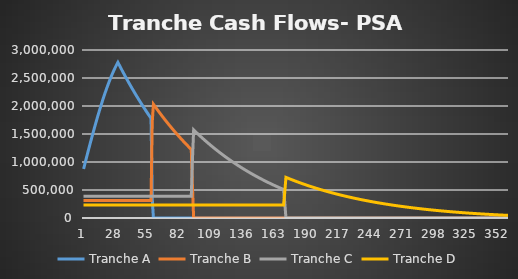
| Category | Tranche A | Tranche B | Tranche C | Tranche D |
|---|---|---|---|---|
| 0 | 876175.253 | 312500 | 390625 | 234375 |
| 1 | 959236.73 | 312500 | 390625 | 234375 |
| 2 | 1041774.351 | 312500 | 390625 | 234375 |
| 3 | 1123702.65 | 312500 | 390625 | 234375 |
| 4 | 1204936.25 | 312500 | 390625 | 234375 |
| 5 | 1285390.009 | 312500 | 390625 | 234375 |
| 6 | 1364979.159 | 312500 | 390625 | 234375 |
| 7 | 1443619.46 | 312500 | 390625 | 234375 |
| 8 | 1521227.336 | 312500 | 390625 | 234375 |
| 9 | 1597720.027 | 312500 | 390625 | 234375 |
| 10 | 1673015.732 | 312500 | 390625 | 234375 |
| 11 | 1747033.754 | 312500 | 390625 | 234375 |
| 12 | 1819694.643 | 312500 | 390625 | 234375 |
| 13 | 1890920.344 | 312500 | 390625 | 234375 |
| 14 | 1960634.332 | 312500 | 390625 | 234375 |
| 15 | 2028761.755 | 312500 | 390625 | 234375 |
| 16 | 2095229.571 | 312500 | 390625 | 234375 |
| 17 | 2159966.681 | 312500 | 390625 | 234375 |
| 18 | 2222904.062 | 312500 | 390625 | 234375 |
| 19 | 2283974.897 | 312500 | 390625 | 234375 |
| 20 | 2343114.696 | 312500 | 390625 | 234375 |
| 21 | 2400261.419 | 312500 | 390625 | 234375 |
| 22 | 2455355.593 | 312500 | 390625 | 234375 |
| 23 | 2508340.422 | 312500 | 390625 | 234375 |
| 24 | 2559161.899 | 312500 | 390625 | 234375 |
| 25 | 2607768.899 | 312500 | 390625 | 234375 |
| 26 | 2654113.284 | 312500 | 390625 | 234375 |
| 27 | 2698149.991 | 312500 | 390625 | 234375 |
| 28 | 2739837.115 | 312500 | 390625 | 234375 |
| 29 | 2779135.987 | 312500 | 390625 | 234375 |
| 30 | 2737980.107 | 312500 | 390625 | 234375 |
| 31 | 2697267.418 | 312500 | 390625 | 234375 |
| 32 | 2656993.197 | 312500 | 390625 | 234375 |
| 33 | 2617152.77 | 312500 | 390625 | 234375 |
| 34 | 2577741.51 | 312500 | 390625 | 234375 |
| 35 | 2538754.844 | 312500 | 390625 | 234375 |
| 36 | 2500188.243 | 312500 | 390625 | 234375 |
| 37 | 2462037.229 | 312500 | 390625 | 234375 |
| 38 | 2424297.371 | 312500 | 390625 | 234375 |
| 39 | 2386964.283 | 312500 | 390625 | 234375 |
| 40 | 2350033.629 | 312500 | 390625 | 234375 |
| 41 | 2313501.117 | 312500 | 390625 | 234375 |
| 42 | 2277362.501 | 312500 | 390625 | 234375 |
| 43 | 2241613.579 | 312500 | 390625 | 234375 |
| 44 | 2206250.196 | 312500 | 390625 | 234375 |
| 45 | 2171268.239 | 312500 | 390625 | 234375 |
| 46 | 2136663.64 | 312500 | 390625 | 234375 |
| 47 | 2102432.373 | 312500 | 390625 | 234375 |
| 48 | 2068570.456 | 312500 | 390625 | 234375 |
| 49 | 2035073.949 | 312500 | 390625 | 234375 |
| 50 | 2001938.953 | 312500 | 390625 | 234375 |
| 51 | 1969161.611 | 312500 | 390625 | 234375 |
| 52 | 1936738.107 | 312500 | 390625 | 234375 |
| 53 | 1904664.667 | 312500 | 390625 | 234375 |
| 54 | 1872937.554 | 312500 | 390625 | 234375 |
| 55 | 1841553.072 | 312500 | 390625 | 234375 |
| 56 | 1810507.567 | 312500 | 390625 | 234375 |
| 57 | 1779797.419 | 312500 | 390625 | 234375 |
| 58 | 355292.807 | 1706626.244 | 390625 | 234375 |
| 59 | 0 | 2031868.919 | 390625 | 234375 |
| 60 | 0 | 2002143.522 | 390625 | 234375 |
| 61 | 0 | 1972739.394 | 390625 | 234375 |
| 62 | 0 | 1943653.104 | 390625 | 234375 |
| 63 | 0 | 1914881.26 | 390625 | 234375 |
| 64 | 0 | 1886420.504 | 390625 | 234375 |
| 65 | 0 | 1858267.516 | 390625 | 234375 |
| 66 | 0 | 1830419.01 | 390625 | 234375 |
| 67 | 0 | 1802871.735 | 390625 | 234375 |
| 68 | 0 | 1775622.474 | 390625 | 234375 |
| 69 | 0 | 1748668.044 | 390625 | 234375 |
| 70 | 0 | 1722005.298 | 390625 | 234375 |
| 71 | 0 | 1695631.12 | 390625 | 234375 |
| 72 | 0 | 1669542.429 | 390625 | 234375 |
| 73 | 0 | 1643736.175 | 390625 | 234375 |
| 74 | 0 | 1618209.342 | 390625 | 234375 |
| 75 | 0 | 1592958.944 | 390625 | 234375 |
| 76 | 0 | 1567982.029 | 390625 | 234375 |
| 77 | 0 | 1543275.676 | 390625 | 234375 |
| 78 | 0 | 1518836.993 | 390625 | 234375 |
| 79 | 0 | 1494663.121 | 390625 | 234375 |
| 80 | 0 | 1470751.231 | 390625 | 234375 |
| 81 | 0 | 1447098.523 | 390625 | 234375 |
| 82 | 0 | 1423702.227 | 390625 | 234375 |
| 83 | 0 | 1400559.604 | 390625 | 234375 |
| 84 | 0 | 1377667.943 | 390625 | 234375 |
| 85 | 0 | 1355024.56 | 390625 | 234375 |
| 86 | 0 | 1332626.804 | 390625 | 234375 |
| 87 | 0 | 1310472.047 | 390625 | 234375 |
| 88 | 0 | 1288557.693 | 390625 | 234375 |
| 89 | 0 | 1266881.171 | 390625 | 234375 |
| 90 | 0 | 1245439.94 | 390625 | 234375 |
| 91 | 0 | 1224231.482 | 390625 | 234375 |
| 92 | 0 | 550651.351 | 1043226.959 | 234375 |
| 93 | 0 | 0 | 1573127.962 | 234375 |
| 94 | 0 | 0 | 1552603 | 234375 |
| 95 | 0 | 0 | 1532301.015 | 234375 |
| 96 | 0 | 0 | 1512219.622 | 234375 |
| 97 | 0 | 0 | 1492356.462 | 234375 |
| 98 | 0 | 0 | 1472709.2 | 234375 |
| 99 | 0 | 0 | 1453275.527 | 234375 |
| 100 | 0 | 0 | 1434053.158 | 234375 |
| 101 | 0 | 0 | 1415039.833 | 234375 |
| 102 | 0 | 0 | 1396233.315 | 234375 |
| 103 | 0 | 0 | 1377631.391 | 234375 |
| 104 | 0 | 0 | 1359231.873 | 234375 |
| 105 | 0 | 0 | 1341032.593 | 234375 |
| 106 | 0 | 0 | 1323031.41 | 234375 |
| 107 | 0 | 0 | 1305226.204 | 234375 |
| 108 | 0 | 0 | 1287614.876 | 234375 |
| 109 | 0 | 0 | 1270195.352 | 234375 |
| 110 | 0 | 0 | 1252965.578 | 234375 |
| 111 | 0 | 0 | 1235923.523 | 234375 |
| 112 | 0 | 0 | 1219067.177 | 234375 |
| 113 | 0 | 0 | 1202394.553 | 234375 |
| 114 | 0 | 0 | 1185903.682 | 234375 |
| 115 | 0 | 0 | 1169592.619 | 234375 |
| 116 | 0 | 0 | 1153459.438 | 234375 |
| 117 | 0 | 0 | 1137502.233 | 234375 |
| 118 | 0 | 0 | 1121719.121 | 234375 |
| 119 | 0 | 0 | 1106108.237 | 234375 |
| 120 | 0 | 0 | 1090667.735 | 234375 |
| 121 | 0 | 0 | 1075395.79 | 234375 |
| 122 | 0 | 0 | 1060290.596 | 234375 |
| 123 | 0 | 0 | 1045350.367 | 234375 |
| 124 | 0 | 0 | 1030573.336 | 234375 |
| 125 | 0 | 0 | 1015957.752 | 234375 |
| 126 | 0 | 0 | 1001501.887 | 234375 |
| 127 | 0 | 0 | 987204.028 | 234375 |
| 128 | 0 | 0 | 973062.481 | 234375 |
| 129 | 0 | 0 | 959075.572 | 234375 |
| 130 | 0 | 0 | 945241.642 | 234375 |
| 131 | 0 | 0 | 931559.051 | 234375 |
| 132 | 0 | 0 | 918026.177 | 234375 |
| 133 | 0 | 0 | 904641.414 | 234375 |
| 134 | 0 | 0 | 891403.174 | 234375 |
| 135 | 0 | 0 | 878309.886 | 234375 |
| 136 | 0 | 0 | 865359.995 | 234375 |
| 137 | 0 | 0 | 852551.962 | 234375 |
| 138 | 0 | 0 | 839884.267 | 234375 |
| 139 | 0 | 0 | 827355.403 | 234375 |
| 140 | 0 | 0 | 814963.882 | 234375 |
| 141 | 0 | 0 | 802708.229 | 234375 |
| 142 | 0 | 0 | 790586.986 | 234375 |
| 143 | 0 | 0 | 778598.712 | 234375 |
| 144 | 0 | 0 | 766741.978 | 234375 |
| 145 | 0 | 0 | 755015.374 | 234375 |
| 146 | 0 | 0 | 743417.502 | 234375 |
| 147 | 0 | 0 | 731946.981 | 234375 |
| 148 | 0 | 0 | 720602.442 | 234375 |
| 149 | 0 | 0 | 709382.534 | 234375 |
| 150 | 0 | 0 | 698285.917 | 234375 |
| 151 | 0 | 0 | 687311.269 | 234375 |
| 152 | 0 | 0 | 676457.279 | 234375 |
| 153 | 0 | 0 | 665722.651 | 234375 |
| 154 | 0 | 0 | 655106.102 | 234375 |
| 155 | 0 | 0 | 644606.365 | 234375 |
| 156 | 0 | 0 | 634222.185 | 234375 |
| 157 | 0 | 0 | 623952.318 | 234375 |
| 158 | 0 | 0 | 613795.539 | 234375 |
| 159 | 0 | 0 | 603750.63 | 234375 |
| 160 | 0 | 0 | 593816.389 | 234375 |
| 161 | 0 | 0 | 583991.627 | 234375 |
| 162 | 0 | 0 | 574275.168 | 234375 |
| 163 | 0 | 0 | 564665.846 | 234375 |
| 164 | 0 | 0 | 555162.509 | 234375 |
| 165 | 0 | 0 | 545764.018 | 234375 |
| 166 | 0 | 0 | 536469.246 | 234375 |
| 167 | 0 | 0 | 527277.077 | 234375 |
| 168 | 0 | 0 | 518186.406 | 234375 |
| 169 | 0 | 0 | 509196.143 | 234375 |
| 170 | 0 | 0 | 276163.768 | 458516.439 |
| 171 | 0 | 0 | 0 | 725887.529 |
| 172 | 0 | 0 | 0 | 717192.052 |
| 173 | 0 | 0 | 0 | 708592.73 |
| 174 | 0 | 0 | 0 | 700088.527 |
| 175 | 0 | 0 | 0 | 691678.421 |
| 176 | 0 | 0 | 0 | 683361.397 |
| 177 | 0 | 0 | 0 | 675136.454 |
| 178 | 0 | 0 | 0 | 667002.601 |
| 179 | 0 | 0 | 0 | 658958.856 |
| 180 | 0 | 0 | 0 | 651004.248 |
| 181 | 0 | 0 | 0 | 643137.818 |
| 182 | 0 | 0 | 0 | 635358.616 |
| 183 | 0 | 0 | 0 | 627665.701 |
| 184 | 0 | 0 | 0 | 620058.145 |
| 185 | 0 | 0 | 0 | 612535.028 |
| 186 | 0 | 0 | 0 | 605095.438 |
| 187 | 0 | 0 | 0 | 597738.477 |
| 188 | 0 | 0 | 0 | 590463.252 |
| 189 | 0 | 0 | 0 | 583268.884 |
| 190 | 0 | 0 | 0 | 576154.5 |
| 191 | 0 | 0 | 0 | 569119.238 |
| 192 | 0 | 0 | 0 | 562162.244 |
| 193 | 0 | 0 | 0 | 555282.673 |
| 194 | 0 | 0 | 0 | 548479.692 |
| 195 | 0 | 0 | 0 | 541752.474 |
| 196 | 0 | 0 | 0 | 535100.2 |
| 197 | 0 | 0 | 0 | 528522.062 |
| 198 | 0 | 0 | 0 | 522017.261 |
| 199 | 0 | 0 | 0 | 515585.004 |
| 200 | 0 | 0 | 0 | 509224.508 |
| 201 | 0 | 0 | 0 | 502934.999 |
| 202 | 0 | 0 | 0 | 496715.71 |
| 203 | 0 | 0 | 0 | 490565.882 |
| 204 | 0 | 0 | 0 | 484484.766 |
| 205 | 0 | 0 | 0 | 478471.618 |
| 206 | 0 | 0 | 0 | 472525.706 |
| 207 | 0 | 0 | 0 | 466646.301 |
| 208 | 0 | 0 | 0 | 460832.686 |
| 209 | 0 | 0 | 0 | 455084.149 |
| 210 | 0 | 0 | 0 | 449399.987 |
| 211 | 0 | 0 | 0 | 443779.504 |
| 212 | 0 | 0 | 0 | 438222.011 |
| 213 | 0 | 0 | 0 | 432726.827 |
| 214 | 0 | 0 | 0 | 427293.279 |
| 215 | 0 | 0 | 0 | 421920.699 |
| 216 | 0 | 0 | 0 | 416608.427 |
| 217 | 0 | 0 | 0 | 411355.812 |
| 218 | 0 | 0 | 0 | 406162.208 |
| 219 | 0 | 0 | 0 | 401026.976 |
| 220 | 0 | 0 | 0 | 395949.484 |
| 221 | 0 | 0 | 0 | 390929.106 |
| 222 | 0 | 0 | 0 | 385965.226 |
| 223 | 0 | 0 | 0 | 381057.23 |
| 224 | 0 | 0 | 0 | 376204.513 |
| 225 | 0 | 0 | 0 | 371406.477 |
| 226 | 0 | 0 | 0 | 366662.528 |
| 227 | 0 | 0 | 0 | 361972.082 |
| 228 | 0 | 0 | 0 | 357334.558 |
| 229 | 0 | 0 | 0 | 352749.382 |
| 230 | 0 | 0 | 0 | 348215.988 |
| 231 | 0 | 0 | 0 | 343733.812 |
| 232 | 0 | 0 | 0 | 339302.301 |
| 233 | 0 | 0 | 0 | 334920.904 |
| 234 | 0 | 0 | 0 | 330589.077 |
| 235 | 0 | 0 | 0 | 326306.284 |
| 236 | 0 | 0 | 0 | 322071.992 |
| 237 | 0 | 0 | 0 | 317885.674 |
| 238 | 0 | 0 | 0 | 313746.809 |
| 239 | 0 | 0 | 0 | 309654.883 |
| 240 | 0 | 0 | 0 | 305609.386 |
| 241 | 0 | 0 | 0 | 301609.814 |
| 242 | 0 | 0 | 0 | 297655.667 |
| 243 | 0 | 0 | 0 | 293746.452 |
| 244 | 0 | 0 | 0 | 289881.681 |
| 245 | 0 | 0 | 0 | 286060.871 |
| 246 | 0 | 0 | 0 | 282283.544 |
| 247 | 0 | 0 | 0 | 278549.227 |
| 248 | 0 | 0 | 0 | 274857.452 |
| 249 | 0 | 0 | 0 | 271207.758 |
| 250 | 0 | 0 | 0 | 267599.686 |
| 251 | 0 | 0 | 0 | 264032.783 |
| 252 | 0 | 0 | 0 | 260506.601 |
| 253 | 0 | 0 | 0 | 257020.698 |
| 254 | 0 | 0 | 0 | 253574.634 |
| 255 | 0 | 0 | 0 | 250167.976 |
| 256 | 0 | 0 | 0 | 246800.295 |
| 257 | 0 | 0 | 0 | 243471.166 |
| 258 | 0 | 0 | 0 | 240180.17 |
| 259 | 0 | 0 | 0 | 236926.89 |
| 260 | 0 | 0 | 0 | 233710.916 |
| 261 | 0 | 0 | 0 | 230531.842 |
| 262 | 0 | 0 | 0 | 227389.264 |
| 263 | 0 | 0 | 0 | 224282.785 |
| 264 | 0 | 0 | 0 | 221212.011 |
| 265 | 0 | 0 | 0 | 218176.553 |
| 266 | 0 | 0 | 0 | 215176.025 |
| 267 | 0 | 0 | 0 | 212210.047 |
| 268 | 0 | 0 | 0 | 209278.24 |
| 269 | 0 | 0 | 0 | 206380.232 |
| 270 | 0 | 0 | 0 | 203515.655 |
| 271 | 0 | 0 | 0 | 200684.142 |
| 272 | 0 | 0 | 0 | 197885.333 |
| 273 | 0 | 0 | 0 | 195118.87 |
| 274 | 0 | 0 | 0 | 192384.399 |
| 275 | 0 | 0 | 0 | 189681.572 |
| 276 | 0 | 0 | 0 | 187010.042 |
| 277 | 0 | 0 | 0 | 184369.467 |
| 278 | 0 | 0 | 0 | 181759.508 |
| 279 | 0 | 0 | 0 | 179179.83 |
| 280 | 0 | 0 | 0 | 176630.102 |
| 281 | 0 | 0 | 0 | 174109.996 |
| 282 | 0 | 0 | 0 | 171619.187 |
| 283 | 0 | 0 | 0 | 169157.356 |
| 284 | 0 | 0 | 0 | 166724.184 |
| 285 | 0 | 0 | 0 | 164319.358 |
| 286 | 0 | 0 | 0 | 161942.567 |
| 287 | 0 | 0 | 0 | 159593.503 |
| 288 | 0 | 0 | 0 | 157271.863 |
| 289 | 0 | 0 | 0 | 154977.346 |
| 290 | 0 | 0 | 0 | 152709.655 |
| 291 | 0 | 0 | 0 | 150468.495 |
| 292 | 0 | 0 | 0 | 148253.575 |
| 293 | 0 | 0 | 0 | 146064.607 |
| 294 | 0 | 0 | 0 | 143901.306 |
| 295 | 0 | 0 | 0 | 141763.39 |
| 296 | 0 | 0 | 0 | 139650.581 |
| 297 | 0 | 0 | 0 | 137562.602 |
| 298 | 0 | 0 | 0 | 135499.181 |
| 299 | 0 | 0 | 0 | 133460.048 |
| 300 | 0 | 0 | 0 | 131444.935 |
| 301 | 0 | 0 | 0 | 129453.579 |
| 302 | 0 | 0 | 0 | 127485.718 |
| 303 | 0 | 0 | 0 | 125541.094 |
| 304 | 0 | 0 | 0 | 123619.45 |
| 305 | 0 | 0 | 0 | 121720.535 |
| 306 | 0 | 0 | 0 | 119844.096 |
| 307 | 0 | 0 | 0 | 117989.888 |
| 308 | 0 | 0 | 0 | 116157.665 |
| 309 | 0 | 0 | 0 | 114347.185 |
| 310 | 0 | 0 | 0 | 112558.207 |
| 311 | 0 | 0 | 0 | 110790.496 |
| 312 | 0 | 0 | 0 | 109043.815 |
| 313 | 0 | 0 | 0 | 107317.934 |
| 314 | 0 | 0 | 0 | 105612.623 |
| 315 | 0 | 0 | 0 | 103927.654 |
| 316 | 0 | 0 | 0 | 102262.803 |
| 317 | 0 | 0 | 0 | 100617.848 |
| 318 | 0 | 0 | 0 | 98992.569 |
| 319 | 0 | 0 | 0 | 97386.748 |
| 320 | 0 | 0 | 0 | 95800.171 |
| 321 | 0 | 0 | 0 | 94232.624 |
| 322 | 0 | 0 | 0 | 92683.896 |
| 323 | 0 | 0 | 0 | 91153.781 |
| 324 | 0 | 0 | 0 | 89642.071 |
| 325 | 0 | 0 | 0 | 88148.563 |
| 326 | 0 | 0 | 0 | 86673.055 |
| 327 | 0 | 0 | 0 | 85215.348 |
| 328 | 0 | 0 | 0 | 83775.245 |
| 329 | 0 | 0 | 0 | 82352.55 |
| 330 | 0 | 0 | 0 | 80947.07 |
| 331 | 0 | 0 | 0 | 79558.615 |
| 332 | 0 | 0 | 0 | 78186.995 |
| 333 | 0 | 0 | 0 | 76832.023 |
| 334 | 0 | 0 | 0 | 75493.515 |
| 335 | 0 | 0 | 0 | 74171.288 |
| 336 | 0 | 0 | 0 | 72865.161 |
| 337 | 0 | 0 | 0 | 71574.955 |
| 338 | 0 | 0 | 0 | 70300.492 |
| 339 | 0 | 0 | 0 | 69041.599 |
| 340 | 0 | 0 | 0 | 67798.1 |
| 341 | 0 | 0 | 0 | 66569.827 |
| 342 | 0 | 0 | 0 | 65356.607 |
| 343 | 0 | 0 | 0 | 64158.275 |
| 344 | 0 | 0 | 0 | 62974.664 |
| 345 | 0 | 0 | 0 | 61805.61 |
| 346 | 0 | 0 | 0 | 60650.95 |
| 347 | 0 | 0 | 0 | 59510.525 |
| 348 | 0 | 0 | 0 | 58384.175 |
| 349 | 0 | 0 | 0 | 57271.744 |
| 350 | 0 | 0 | 0 | 56173.075 |
| 351 | 0 | 0 | 0 | 55088.015 |
| 352 | 0 | 0 | 0 | 54016.412 |
| 353 | 0 | 0 | 0 | 52958.116 |
| 354 | 0 | 0 | 0 | 51912.978 |
| 355 | 0 | 0 | 0 | 50880.85 |
| 356 | 0 | 0 | 0 | 49861.587 |
| 357 | 0 | 0 | 0 | 48855.045 |
| 358 | 0 | 0 | 0 | 47861.082 |
| 359 | 0 | 0 | 0 | 46879.556 |